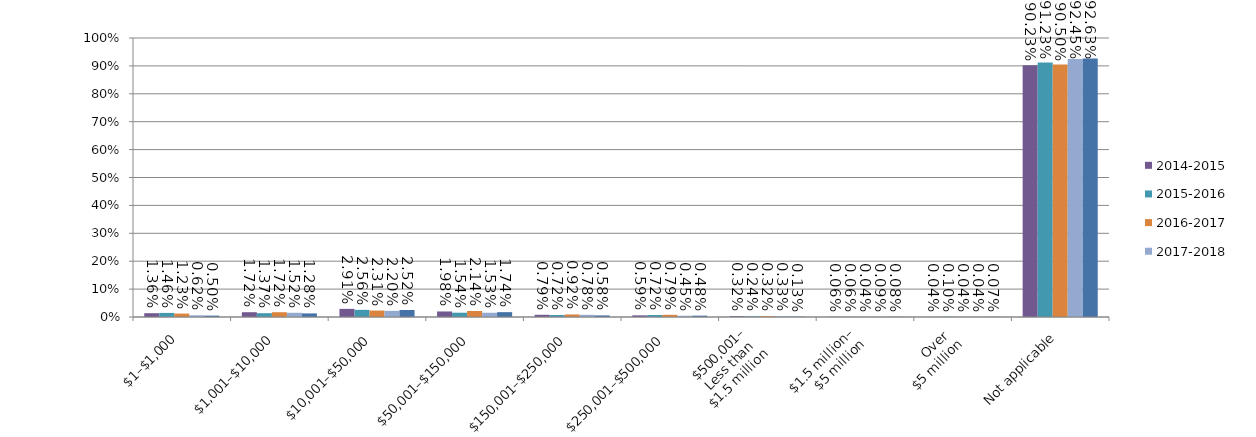
| Category | 2014-2015 | 2015-2016 | 2016-2017 | 2017-2018 | 2018-2019 |
|---|---|---|---|---|---|
| $1–$1,000 | 0.014 | 0.015 | 0.012 | 0.006 | 0.005 |
| $1,001–$10,000 | 0.017 | 0.014 | 0.017 | 0.015 | 0.013 |
| $10,001–$50,000 | 0.029 | 0.026 | 0.023 | 0.022 | 0.025 |
| $50,001–$150,000 | 0.02 | 0.015 | 0.021 | 0.015 | 0.017 |
| $150,001–$250,000 | 0.008 | 0.007 | 0.009 | 0.008 | 0.006 |
| $250,001–$500,000 | 0.006 | 0.007 | 0.008 | 0.004 | 0.005 |
| $500,001–
Less than 
$1.5 million | 0.003 | 0.002 | 0.003 | 0.003 | 0.001 |
| $1.5 million–
$5 million | 0.001 | 0.001 | 0 | 0.001 | 0.001 |
| Over 
$5 million | 0 | 0.001 | 0 | 0 | 0.001 |
| Not applicable | 0.902 | 0.912 | 0.905 | 0.924 | 0.926 |